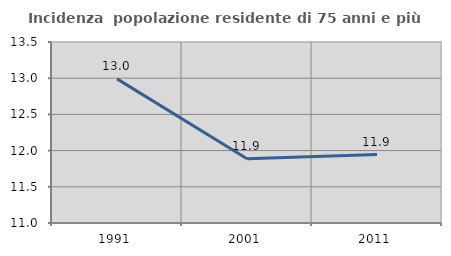
| Category | Incidenza  popolazione residente di 75 anni e più |
|---|---|
| 1991.0 | 12.99 |
| 2001.0 | 11.888 |
| 2011.0 | 11.945 |